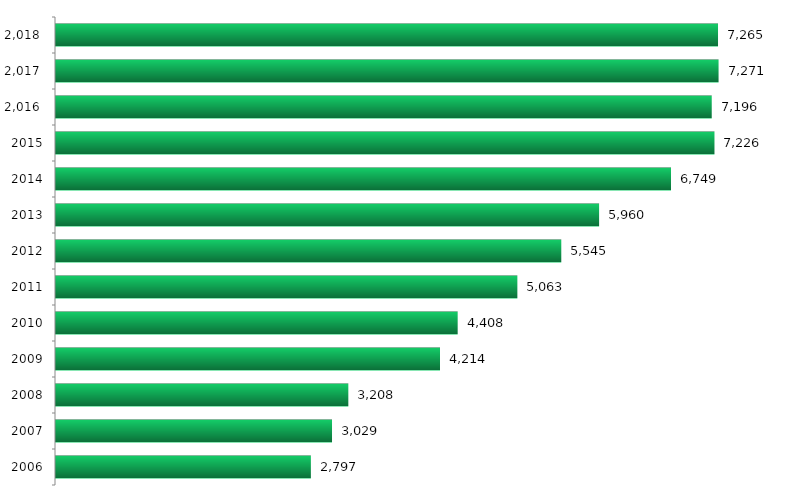
| Category | Matriculados |
|---|---|
| 2006.0 | 2797 |
| 2007.0 | 3029 |
| 2008.0 | 3208 |
| 2009.0 | 4214 |
| 2010.0 | 4408 |
| 2011.0 | 5063 |
| 2012.0 | 5545 |
| 2013.0 | 5960 |
| 2014.0 | 6749 |
| 2015.0 | 7226 |
| 2016.0 | 7196 |
| 2017.0 | 7271 |
| 2018.0 | 7265 |